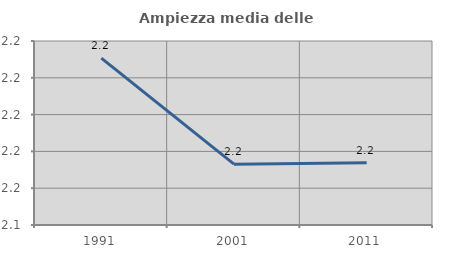
| Category | Ampiezza media delle famiglie |
|---|---|
| 1991.0 | 2.231 |
| 2001.0 | 2.173 |
| 2011.0 | 2.174 |